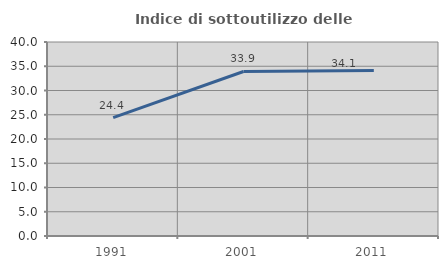
| Category | Indice di sottoutilizzo delle abitazioni  |
|---|---|
| 1991.0 | 24.415 |
| 2001.0 | 33.923 |
| 2011.0 | 34.126 |